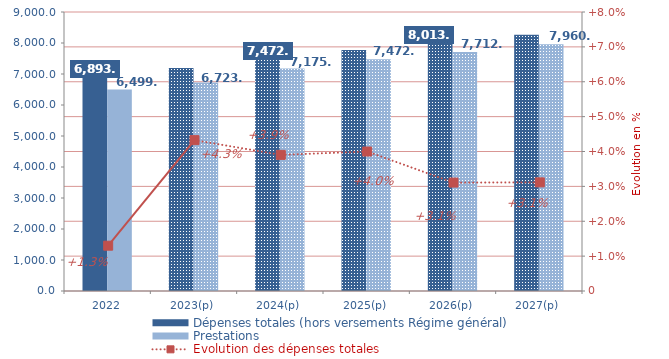
| Category | Dépenses totales (hors versements Régime général) | Prestations |
|---|---|---|
| 2022 | 6893.747 | 6499.381 |
| 2023(p) | 7191.954 | 6723.624 |
| 2024(p) | 7472.666 | 7175.527 |
| 2025(p) | 7771.539 | 7472.569 |
| 2026(p) | 8013.131 | 7712.373 |
| 2027(p) | 8262.744 | 7960.11 |